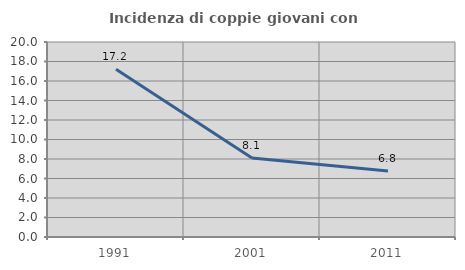
| Category | Incidenza di coppie giovani con figli |
|---|---|
| 1991.0 | 17.216 |
| 2001.0 | 8.108 |
| 2011.0 | 6.78 |